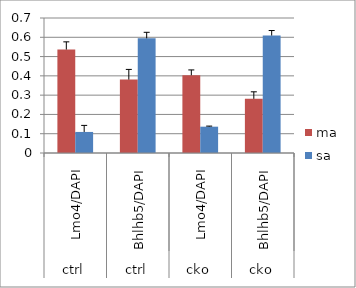
| Category | ma | sa |
|---|---|---|
| 0 | 0.536 | 0.109 |
| 1 | 0.381 | 0.595 |
| 2 | 0.403 | 0.136 |
| 3 | 0.281 | 0.609 |